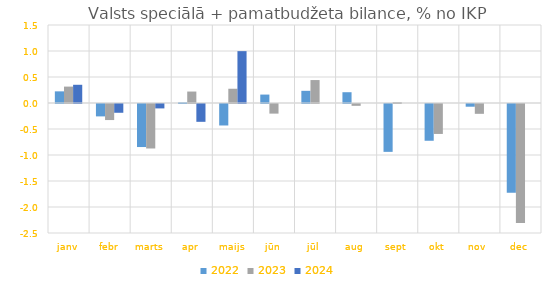
| Category | 2022 | 2023 | 2024 |
|---|---|---|---|
| janv | 0.224 | 0.315 | 0.35 |
| febr | -0.238 | -0.309 | -0.169 |
| marts | -0.828 | -0.856 | -0.085 |
| apr | 0.012 | 0.22 | -0.343 |
| maijs | -0.413 | 0.274 | 0.997 |
| jūn | 0.162 | -0.185 | 0 |
| jūl | 0.234 | 0.441 | 0 |
| aug | 0.207 | -0.035 | 0 |
| sept | -0.921 | 0.016 | 0 |
| okt | -0.707 | -0.576 | 0 |
| nov | -0.052 | -0.189 | 0 |
| dec | -1.707 | -2.289 | 0 |